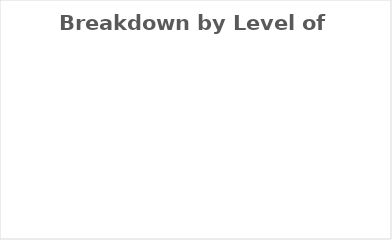
| Category | Breakdown by Level of Activity |
|---|---|
| Aware | 0 |
| Capable | 0 |
| Skilled | 0 |
| Expert | 0 |